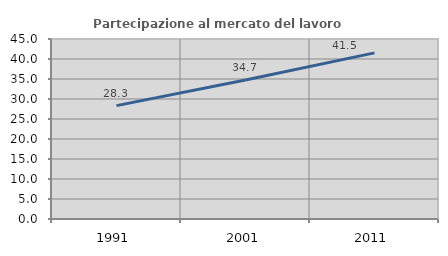
| Category | Partecipazione al mercato del lavoro  femminile |
|---|---|
| 1991.0 | 28.339 |
| 2001.0 | 34.74 |
| 2011.0 | 41.528 |